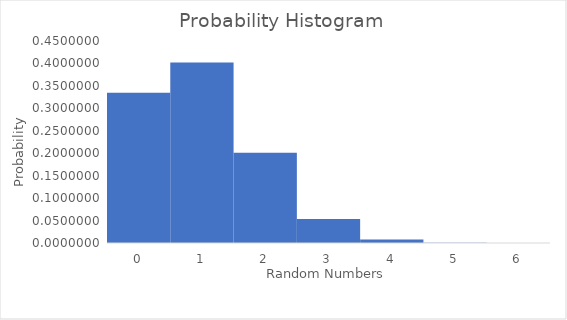
| Category | Series 0 |
|---|---|
| 0.0 | 0.335 |
| 1.0 | 0.402 |
| 2.0 | 0.201 |
| 3.0 | 0.054 |
| 4.0 | 0.008 |
| 5.0 | 0.001 |
| 6.0 | 0 |